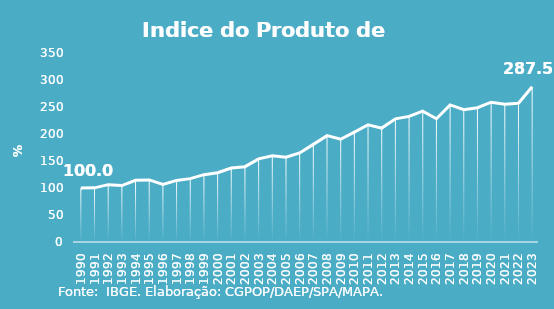
| Category | Indice de Prod. base 1990 |
|---|---|
| 1990.0 | 100 |
| 1991.0 | 100.275 |
| 1992.0 | 106.203 |
| 1993.0 | 104.57 |
| 1994.0 | 114.164 |
| 1995.0 | 115.024 |
| 1996.0 | 106.552 |
| 1997.0 | 114.037 |
| 1998.0 | 117.319 |
| 1999.0 | 124.734 |
| 2000.0 | 128.293 |
| 2001.0 | 136.975 |
| 2002.0 | 139.51 |
| 2003.0 | 153.868 |
| 2004.0 | 159.641 |
| 2005.0 | 157.136 |
| 2006.0 | 164.858 |
| 2007.0 | 180.781 |
| 2008.0 | 196.91 |
| 2009.0 | 190.309 |
| 2010.0 | 203.581 |
| 2011.0 | 217.041 |
| 2012.0 | 210.932 |
| 2013.0 | 228.009 |
| 2014.0 | 232.562 |
| 2015.0 | 242.318 |
| 2016.0 | 228.239 |
| 2017.0 | 253.826 |
| 2018.0 | 245.134 |
| 2019.0 | 248.619 |
| 2020.0 | 258.848 |
| 2021.0 | 254.988 |
| 2022.0 | 256.903 |
| 2023.0 | 287.498 |